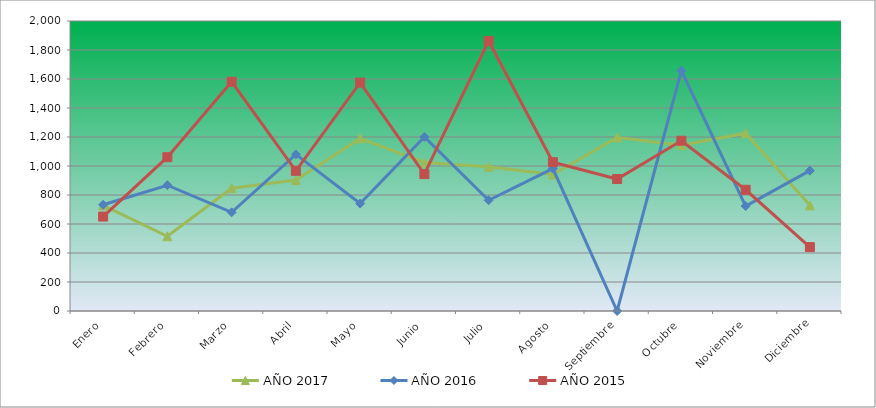
| Category | AÑO 2017 | AÑO 2016 | AÑO 2015 |
|---|---|---|---|
| Enero | 728.489 | 732.399 | 651.169 |
| Febrero | 515.272 | 867.391 | 1060.638 |
| Marzo | 846.942 | 680.701 | 1581.005 |
| Abril | 903.207 | 1079.93 | 966.801 |
| Mayo | 1190.457 | 741.016 | 1575.318 |
| Junio | 1024.622 | 1200.56 | 944.053 |
| Julio | 995.009 | 763.993 | 1862.514 |
| Agosto | 941.705 | 982.277 | 1026.516 |
| Septiembre | 1196.38 | 0 | 909.931 |
| Octubre | 1143.076 | 1657.233 | 1174.379 |
| Noviembre | 1225.993 | 723.783 | 835.999 |
| Diciembre | 728.489 | 967.916 | 440.748 |